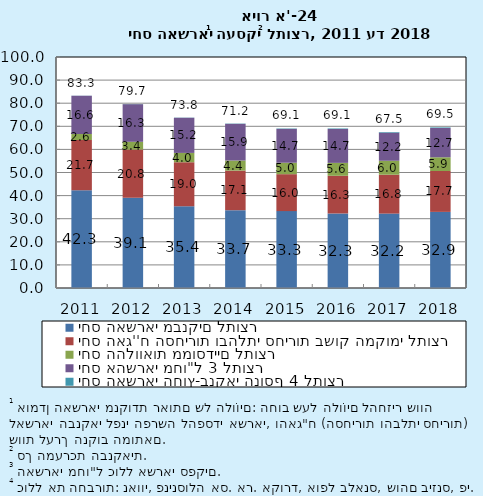
| Category | יחס האשראי מבנקים לתוצר | יחס האג''ח הסחירות ובהלתי סחירות בשוק המקומי לתוצר | יחס ההלוואות ממוסדיים לתוצר | יחס אהשראי מחו"ל 3 לתוצר | יחס האשראי החוץ-בנקאי הנוסף 4 לתוצר |
|---|---|---|---|---|---|
| 2011.0 | 42.334 | 21.725 | 2.605 | 16.561 | 0.05 |
| 2012.0 | 39.094 | 20.835 | 3.365 | 16.295 | 0.063 |
| 2013.0 | 35.397 | 19.048 | 4.034 | 15.216 | 0.086 |
| 2014.0 | 33.685 | 17.137 | 4.368 | 15.876 | 0.13 |
| 2015.0 | 33.289 | 15.986 | 4.955 | 14.661 | 0.174 |
| 2016.0 | 32.262 | 16.311 | 5.595 | 14.669 | 0.227 |
| 2017.0 | 32.213 | 16.825 | 6.043 | 12.18 | 0.259 |
| 2018.0 | 32.942 | 17.714 | 5.939 | 12.665 | 0.263 |